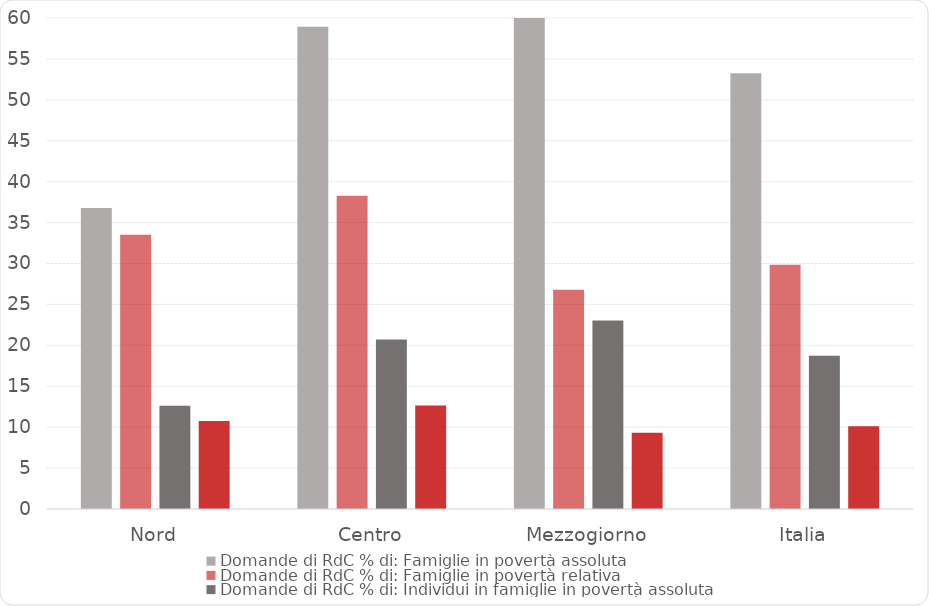
| Category | Domande di RdC % di: |
|---|---|
| Nord | 10.751 |
| Centro | 12.642 |
| Mezzogiorno | 9.303 |
| Italia | 10.103 |